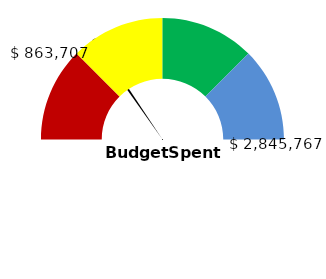
| Category | Series 1 |
|---|---|
| 0 | 30.351 |
| 1 | 1 |
| 2 | 168.649 |